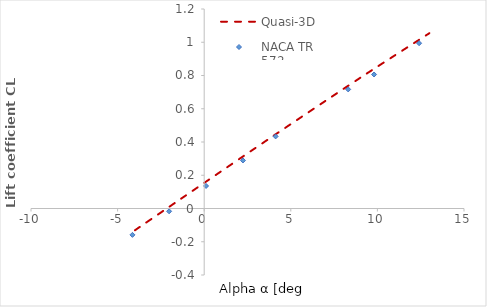
| Category | Quasi-3D |
|---|---|
| -4.0 | -0.131 |
| -2.0 | 0.012 |
| 0.0 | 0.154 |
| 4.0 | 0.437 |
| 8.0 | 0.716 |
| 10.0 | 0.853 |
| 13.0 | 1.054 |